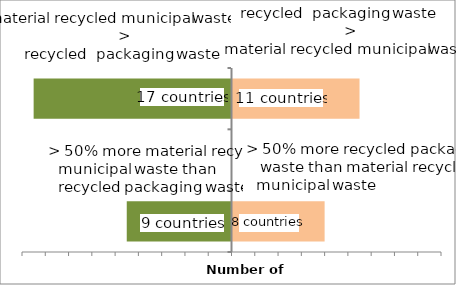
| Category | Series 1 | Series 0 |
|---|---|---|
| 50%  | 8 | -9 |
|  | 0 | 0 |
| total | 11 | -17 |